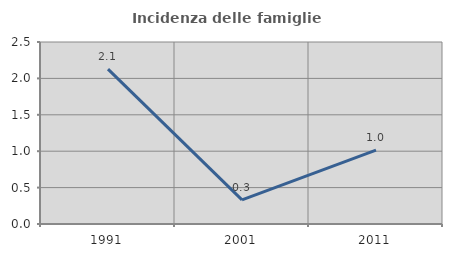
| Category | Incidenza delle famiglie numerose |
|---|---|
| 1991.0 | 2.128 |
| 2001.0 | 0.331 |
| 2011.0 | 1.014 |